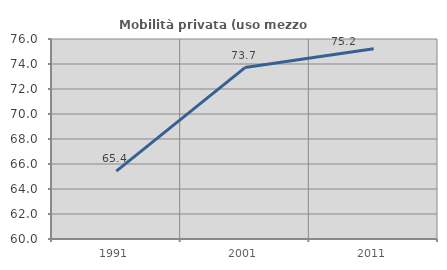
| Category | Mobilità privata (uso mezzo privato) |
|---|---|
| 1991.0 | 65.433 |
| 2001.0 | 73.714 |
| 2011.0 | 75.227 |